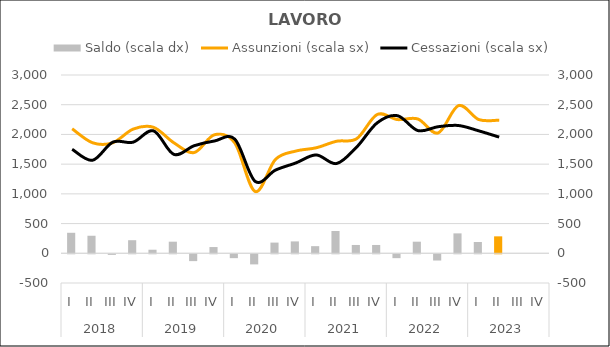
| Category | Saldo (scala dx) |
|---|---|
| 0 | 345 |
| 1 | 295 |
| 2 | -10 |
| 3 | 220 |
| 4 | 60 |
| 5 | 195 |
| 6 | -115 |
| 7 | 105 |
| 8 | -65 |
| 9 | -170 |
| 10 | 180 |
| 11 | 200 |
| 12 | 120 |
| 13 | 375 |
| 14 | 140 |
| 15 | 140 |
| 16 | -65 |
| 17 | 195 |
| 18 | -105 |
| 19 | 335 |
| 20 | 190 |
| 21 | 285 |
| 22 | 0 |
| 23 | 0 |